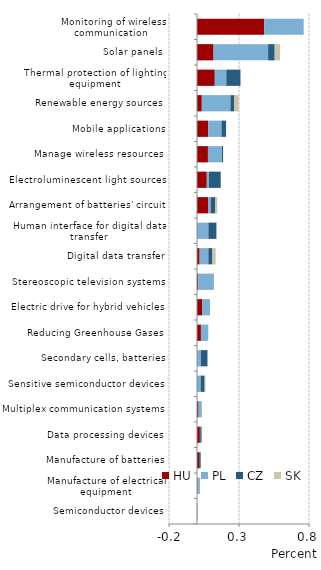
| Category | HU | PL | CZ | SK |
|---|---|---|---|---|
| Semiconductor devices | 0.001 | 0.004 | 0 | 0 |
| Manufacture of electrical equipment | 0.004 | 0.017 | 0 | 0 |
| Manufacture of batteries | 0.015 | 0 | 0.011 | 0 |
| Data processing devices | 0.021 | 0.002 | 0.01 | 0 |
| Multiplex communication systems | 0.011 | 0.022 | 0.001 | 0 |
| Sensitive semiconductor devices | 0 | 0.026 | 0.029 | 0.005 |
| Secondary cells, batteries | 0.003 | 0.025 | 0.047 | 0 |
| Reducing Greenhouse Gases | 0.028 | 0.053 | 0 | 0 |
| Electric drive for hybrid vehicles | 0.036 | 0.057 | 0 | 0 |
| Stereoscopic television systems | 0.008 | 0.112 | 0 | 0 |
| Digital data transfer | 0.019 | 0.062 | 0.029 | 0.023 |
| Human interface for digital data transfer | 0 | 0.081 | 0.057 | 0 |
| Arrangement of batteries' circuit | 0.079 | 0.019 | 0.033 | 0.013 |
| Electroluminescent light sources | 0.07 | 0.015 | 0.084 | 0 |
| Manage wireless resources | 0.078 | 0.1 | 0.008 | 0 |
| Mobile applications | 0.08 | 0.095 | 0.033 | 0 |
| Renewable energy sources | 0.034 | 0.204 | 0.029 | 0.031 |
| Thermal protection of lighting equipment | 0.127 | 0.082 | 0.101 | 0 |
| Solar panels | 0.118 | 0.39 | 0.047 | 0.038 |
| Monitoring of wireless communication  | 0.48 | 0.281 | 0.001 | 0 |